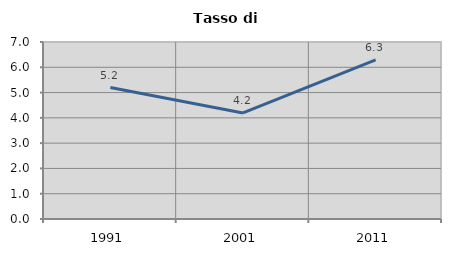
| Category | Tasso di disoccupazione   |
|---|---|
| 1991.0 | 5.197 |
| 2001.0 | 4.196 |
| 2011.0 | 6.293 |